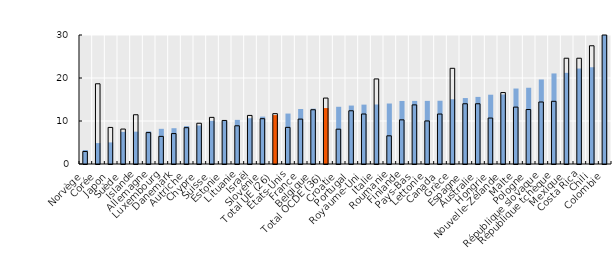
| Category | Nés à l’étranger | Nés dans le pays |
|---|---|---|
| Colombie | 47.2 | 41.8 |
| Chili | 22.5 | 27.5 |
| Costa Rica | 22.2 | 24.6 |
| Mexique | 21.2 | 24.6 |
| République tchèque | 21.06 | 14.58 |
| République slovaque | 19.656 | 14.421 |
| Pologne | 17.733 | 12.668 |
| Malte | 17.552 | 13.229 |
| Nouvelle-Zélande | 16.168 | 16.612 |
| Hongrie | 16.113 | 10.686 |
| Australie | 15.605 | 14.012 |
| Espagne | 15.336 | 14.008 |
| Grèce | 15.06 | 22.253 |
| Canada | 14.713 | 11.618 |
| Lettonie | 14.68 | 10.011 |
| Pays-Bas | 14.669 | 13.748 |
| Finlande | 14.66 | 10.266 |
| Roumanie | 14.066 | 6.554 |
| Italie | 13.837 | 19.784 |
| Royaume-Uni | 13.808 | 11.626 |
| Portugal | 13.591 | 12.378 |
| Croatie | 13.307 | 8.096 |
| Total OCDE (36) | 13.008 | 15.334 |
| Belgique | 12.863 | 12.619 |
| France | 12.788 | 10.442 |
| États-Unis | 11.73 | 8.52 |
| Total UE (26) | 11.369 | 11.708 |
| Slovénie | 11.019 | 10.536 |
| Israël | 10.65 | 11.3 |
| Lituanie | 10.265 | 8.886 |
| Estonie | 10.11 | 10.127 |
| Suisse | 10.042 | 10.843 |
| Chypre | 8.955 | 9.478 |
| Autriche | 8.816 | 8.447 |
| Danemark | 8.321 | 7.072 |
| Luxembourg | 8.18 | 6.422 |
| Allemagne | 7.578 | 7.301 |
| Islande | 7.519 | 11.454 |
| Suède | 7.469 | 8.128 |
| Japon | 5.019 | 8.506 |
| Corée | 4.863 | 18.658 |
| Norvège | 3.251 | 2.909 |